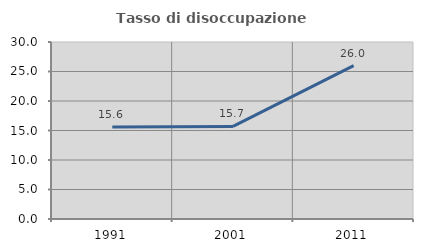
| Category | Tasso di disoccupazione giovanile  |
|---|---|
| 1991.0 | 15.584 |
| 2001.0 | 15.686 |
| 2011.0 | 26 |